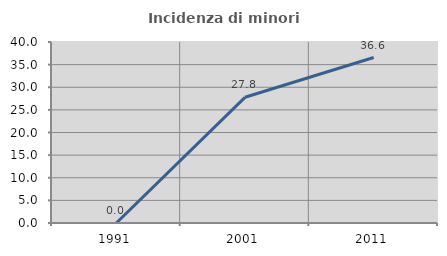
| Category | Incidenza di minori stranieri |
|---|---|
| 1991.0 | 0 |
| 2001.0 | 27.778 |
| 2011.0 | 36.573 |